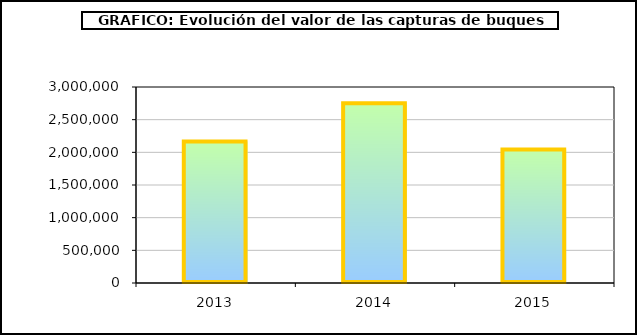
| Category | Series 0 |
|---|---|
| 0 | 2165361.923 |
| 1 | 2750204.662 |
| 2 | 2043456.849 |